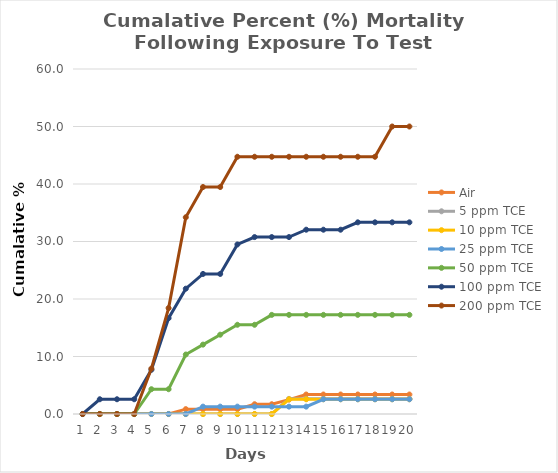
| Category | Air | 5 ppm TCE | 10 ppm TCE | 25 ppm TCE | 50 ppm TCE | 100 ppm TCE | 200 ppm TCE |
|---|---|---|---|---|---|---|---|
| 0 | 0 | 0 | 0 | 0 | 0 | 0 | 0 |
| 1 | 0 | 0 | 0 | 0 | 0 | 2.564 | 0 |
| 2 | 0 | 0 | 0 | 0 | 0 | 2.564 | 0 |
| 3 | 0 | 0 | 0 | 0 | 0 | 2.564 | 0 |
| 4 | 0 | 0 | 0 | 0 | 4.31 | 7.692 | 7.895 |
| 5 | 0 | 0 | 0 | 0 | 4.31 | 16.667 | 18.421 |
| 6 | 0.847 | 0 | 0 | 0 | 10.345 | 21.795 | 34.211 |
| 7 | 0.847 | 0 | 0 | 1.282 | 12.069 | 24.359 | 39.474 |
| 8 | 0.847 | 0 | 0 | 1.282 | 13.793 | 24.359 | 39.474 |
| 9 | 0.847 | 0 | 0 | 1.282 | 15.517 | 29.487 | 44.737 |
| 10 | 1.7 | 0 | 0 | 1.282 | 15.517 | 30.769 | 44.737 |
| 11 | 1.7 | 0 | 0 | 1.282 | 17.241 | 30.769 | 44.737 |
| 12 | 2.5 | 2.632 | 2.564 | 1.282 | 17.241 | 30.769 | 44.737 |
| 13 | 3.39 | 2.632 | 2.564 | 1.282 | 17.241 | 32.051 | 44.737 |
| 14 | 3.39 | 2.632 | 2.564 | 2.564 | 17.241 | 32.051 | 44.737 |
| 15 | 3.39 | 2.632 | 2.564 | 2.564 | 17.241 | 32.051 | 44.737 |
| 16 | 3.39 | 2.632 | 2.564 | 2.564 | 17.241 | 33.333 | 44.737 |
| 17 | 3.39 | 2.632 | 2.564 | 2.564 | 17.241 | 33.333 | 44.737 |
| 18 | 3.39 | 2.632 | 2.564 | 2.564 | 17.241 | 33.333 | 50 |
| 19 | 3.39 | 2.632 | 2.564 | 2.564 | 17.241 | 33.333 | 50 |